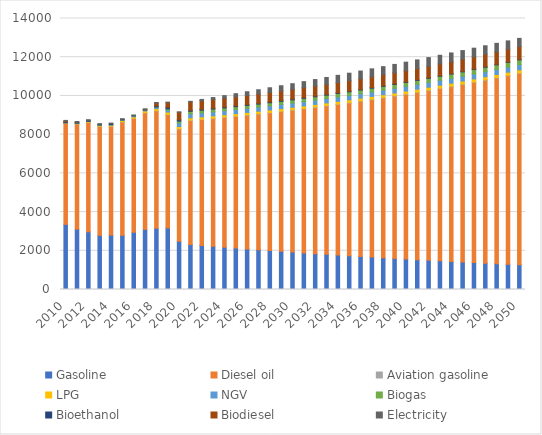
| Category | Gasoline | Diesel oil | Aviation gasoline | LPG | NGV | Biogas | Bioethanol | Biodiesel | Electricity |
|---|---|---|---|---|---|---|---|---|---|
| 2010.0 | 3365.722 | 5210.222 | 11.11 | 26.111 | 0.556 | 0.556 | 46.52 | 37.778 | 37.056 |
| 2011.0 | 3116.667 | 5428.5 | 13.481 | 29.006 | 3.056 | 0.556 | 46.52 | 7.5 | 34 |
| 2012.0 | 2982.222 | 5651.75 | 11.99 | 37.752 | 6.389 | 0.556 | 46.52 | 0 | 34 |
| 2013.0 | 2798.889 | 5628.25 | 15.498 | 44.362 | 10 | 0.556 | 34.89 | 0 | 36 |
| 2014.0 | 2811.111 | 5616.5 | 15.644 | 53.058 | 18.333 | 0.556 | 58.15 | 0 | 25 |
| 2015.0 | 2798.889 | 5851.5 | 16.524 | 63.283 | 32.222 | 0.556 | 34.89 | 0 | 23 |
| 2016.0 | 2957.778 | 5879.02 | 13.457 | 71.111 | 48.056 | 0.556 | 22.222 | 0 | 23 |
| 2017.0 | 3104.444 | 6017.762 | 14.214 | 85 | 54.444 | 0.556 | 11.111 | 17.5 | 29 |
| 2018.0 | 3165.556 | 6063.245 | 15.864 | 102.5 | 82.778 | 0.556 | 56.944 | 146.111 | 27 |
| 2019.0 | 3177.778 | 5851.183 | 15.119 | 122.222 | 106.944 | 60 | 85.833 | 232.778 | 29 |
| 2020.0 | 2493.333 | 5796.111 | 13.889 | 117.5 | 180.833 | 97.5 | 71.944 | 380.833 | 25.833 |
| 2021.0 | 2322.222 | 6404.444 | 21.667 | 121.389 | 200 | 137.5 | 49.167 | 434.444 | 30 |
| 2022.0 | 2275.081 | 6500.831 | 21.883 | 122.603 | 202 | 140.264 | 48.169 | 440.983 | 66.228 |
| 2023.0 | 2228.897 | 6598.669 | 22.102 | 123.829 | 204.02 | 143.083 | 47.191 | 447.62 | 100.812 |
| 2024.0 | 2183.65 | 6697.979 | 22.323 | 125.067 | 206.06 | 145.959 | 46.233 | 454.356 | 133.757 |
| 2025.0 | 2139.322 | 6798.783 | 22.546 | 126.318 | 208.121 | 148.893 | 45.294 | 461.194 | 165.066 |
| 2026.0 | 2095.894 | 6901.105 | 22.772 | 127.581 | 210.202 | 151.886 | 44.375 | 468.135 | 194.744 |
| 2027.0 | 2053.347 | 7004.967 | 23 | 128.857 | 212.304 | 154.938 | 43.474 | 475.181 | 222.793 |
| 2028.0 | 2011.664 | 7110.391 | 23.23 | 130.145 | 214.427 | 158.053 | 42.591 | 482.332 | 249.215 |
| 2029.0 | 1970.828 | 7217.403 | 23.462 | 131.447 | 216.571 | 161.23 | 41.727 | 489.591 | 274.011 |
| 2030.0 | 1930.82 | 7326.025 | 23.697 | 132.761 | 218.737 | 164.47 | 40.88 | 496.96 | 297.183 |
| 2031.0 | 1891.624 | 7436.281 | 23.933 | 134.089 | 220.924 | 167.776 | 40.05 | 504.439 | 318.73 |
| 2032.0 | 1853.224 | 7548.197 | 24.173 | 135.43 | 223.134 | 171.148 | 39.237 | 512.031 | 338.652 |
| 2033.0 | 1815.604 | 7661.798 | 24.415 | 136.784 | 225.365 | 174.589 | 38.44 | 519.737 | 356.947 |
| 2034.0 | 1778.747 | 7777.108 | 24.659 | 138.152 | 227.619 | 178.098 | 37.66 | 527.559 | 373.614 |
| 2035.0 | 1742.638 | 7894.153 | 24.905 | 139.533 | 229.895 | 181.678 | 36.896 | 535.499 | 388.65 |
| 2036.0 | 1707.263 | 8012.96 | 25.154 | 140.929 | 232.194 | 185.329 | 36.147 | 543.558 | 402.052 |
| 2037.0 | 1672.605 | 8133.555 | 25.406 | 142.338 | 234.516 | 189.054 | 35.413 | 551.738 | 413.816 |
| 2038.0 | 1638.652 | 8255.965 | 25.66 | 143.761 | 236.861 | 192.854 | 34.694 | 560.042 | 423.936 |
| 2039.0 | 1605.387 | 8380.218 | 25.917 | 145.199 | 239.229 | 196.731 | 33.99 | 568.471 | 432.409 |
| 2040.0 | 1572.798 | 8506.34 | 26.176 | 146.651 | 241.622 | 200.685 | 33.3 | 577.026 | 439.229 |
| 2041.0 | 1540.87 | 8634.36 | 26.437 | 148.118 | 244.038 | 204.719 | 32.624 | 585.71 | 444.388 |
| 2042.0 | 1509.59 | 8764.308 | 26.702 | 149.599 | 246.478 | 208.834 | 31.961 | 594.525 | 447.88 |
| 2043.0 | 1478.945 | 8896.21 | 26.969 | 151.095 | 248.943 | 213.031 | 31.313 | 603.473 | 449.696 |
| 2044.0 | 1448.923 | 9030.098 | 27.239 | 152.606 | 251.433 | 217.313 | 30.677 | 612.555 | 449.829 |
| 2045.0 | 1419.51 | 9166.001 | 27.511 | 154.132 | 253.947 | 221.681 | 30.054 | 621.774 | 448.269 |
| 2046.0 | 1390.694 | 9303.95 | 27.786 | 155.673 | 256.486 | 226.137 | 29.444 | 631.132 | 445.006 |
| 2047.0 | 1362.463 | 9443.974 | 28.064 | 157.23 | 259.051 | 230.682 | 28.846 | 640.63 | 440.03 |
| 2048.0 | 1334.805 | 9586.106 | 28.345 | 158.802 | 261.642 | 235.319 | 28.261 | 650.272 | 433.33 |
| 2049.0 | 1307.708 | 9730.377 | 28.628 | 160.39 | 264.258 | 240.049 | 27.687 | 660.059 | 424.894 |
| 2050.0 | 1281.162 | 9876.819 | 28.914 | 161.994 | 266.901 | 244.874 | 27.125 | 669.992 | 414.709 |